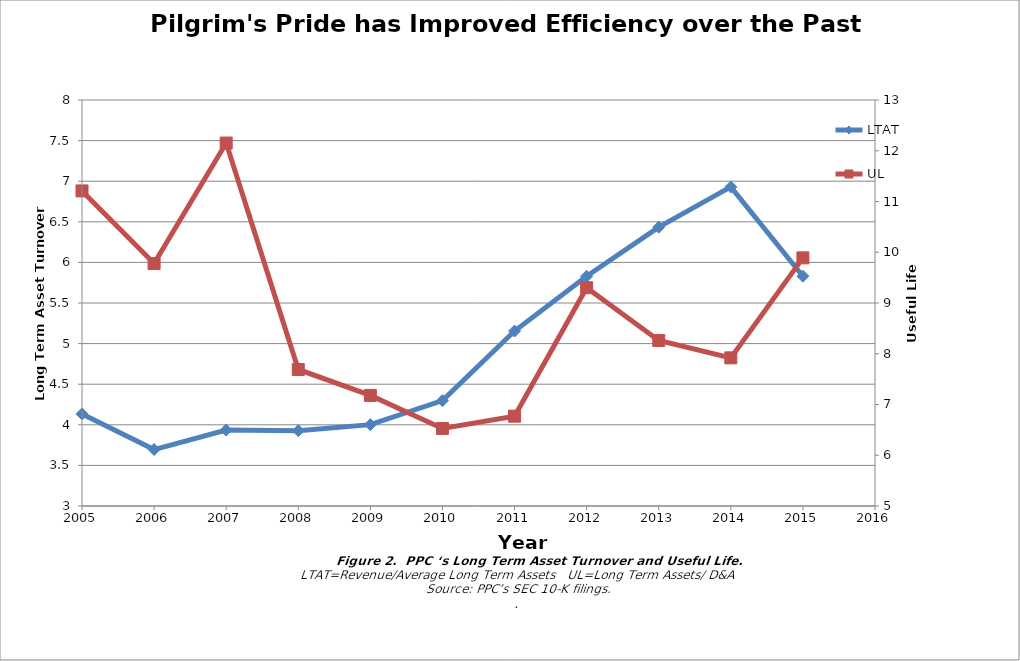
| Category | LTAT |
|---|---|
| 2005.0 | 4.134 |
| 2006.0 | 3.695 |
| 2007.0 | 3.935 |
| 2008.0 | 3.928 |
| 2009.0 | 4.002 |
| 2010.0 | 4.297 |
| 2011.0 | 5.155 |
| 2012.0 | 5.829 |
| 2013.0 | 6.434 |
| 2014.0 | 6.929 |
| 2015.0 | 5.83 |